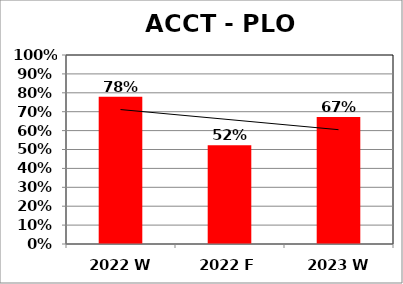
| Category | Series 0 |
|---|---|
| 2022 W | 0.779 |
| 2022 F | 0.523 |
| 2023 W | 0.673 |